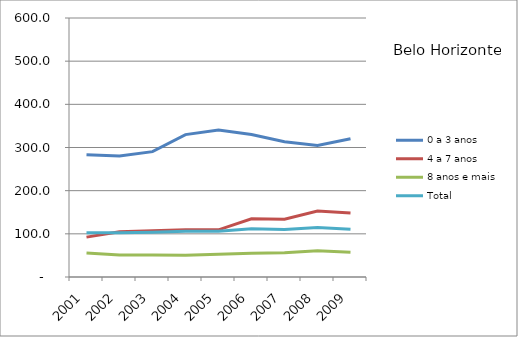
| Category | 0 a 3 anos | 4 a 7 anos | 8 anos e mais | Total |
|---|---|---|---|---|
| 2001.0 | 283.4 | 92.4 | 55.7 | 102.4 |
| 2002.0 | 280.5 | 104.8 | 51.1 | 102.4 |
| 2003.0 | 290.4 | 107.2 | 51 | 103.6 |
| 2004.0 | 329.9 | 109.3 | 50.5 | 105.9 |
| 2005.0 | 340.3 | 109.3 | 52.8 | 106 |
| 2006.0 | 329.9 | 134.7 | 55.1 | 111.9 |
| 2007.0 | 313.4 | 133.8 | 56.2 | 110 |
| 2008.0 | 304.7 | 152.8 | 60.7 | 114.8 |
| 2009.0 | 320.3 | 148.2 | 57.5 | 110.9 |